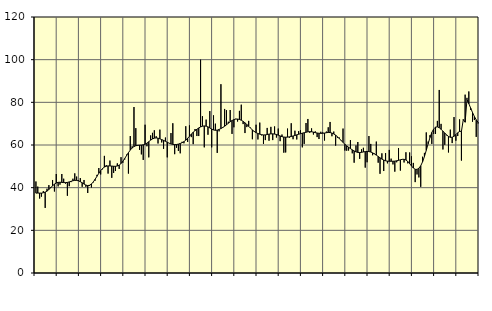
| Category | Piggar | Series 1 |
|---|---|---|
| nan | 42.9 | 37.44 |
| 1.0 | 40.5 | 37.48 |
| 1.0 | 34.9 | 37.45 |
| 1.0 | 35.8 | 37.44 |
| 1.0 | 38.4 | 37.61 |
| 1.0 | 30.5 | 37.92 |
| 1.0 | 39.5 | 38.38 |
| 1.0 | 41.2 | 39.11 |
| 1.0 | 40.3 | 39.99 |
| 1.0 | 43.6 | 40.89 |
| 1.0 | 38.2 | 41.66 |
| 1.0 | 46.4 | 42.21 |
| nan | 40.6 | 42.49 |
| 2.0 | 41.4 | 42.54 |
| 2.0 | 46.4 | 42.47 |
| 2.0 | 44.2 | 42.38 |
| 2.0 | 41.9 | 42.36 |
| 2.0 | 36.2 | 42.46 |
| 2.0 | 40.7 | 42.7 |
| 2.0 | 42.6 | 42.99 |
| 2.0 | 44.2 | 43.25 |
| 2.0 | 46.7 | 43.41 |
| 2.0 | 45.2 | 43.41 |
| 2.0 | 43.6 | 43.21 |
| nan | 44.5 | 42.8 |
| 3.0 | 40.4 | 42.28 |
| 3.0 | 43.6 | 41.7 |
| 3.0 | 40.4 | 41.21 |
| 3.0 | 37.5 | 40.98 |
| 3.0 | 40.8 | 41.14 |
| 3.0 | 40.1 | 41.72 |
| 3.0 | 42.5 | 42.68 |
| 3.0 | 43.3 | 43.94 |
| 3.0 | 46 | 45.34 |
| 3.0 | 49.2 | 46.74 |
| 3.0 | 46.2 | 47.98 |
| nan | 48.6 | 48.97 |
| 4.0 | 54.9 | 49.65 |
| 4.0 | 50.6 | 50.04 |
| 4.0 | 46.6 | 50.2 |
| 4.0 | 52.7 | 50.2 |
| 4.0 | 44.6 | 50.12 |
| 4.0 | 46.9 | 50.03 |
| 4.0 | 47.8 | 50.01 |
| 4.0 | 51.4 | 50.16 |
| 4.0 | 48.8 | 50.57 |
| 4.0 | 54.3 | 51.31 |
| 4.0 | 51.7 | 52.4 |
| nan | 53.2 | 53.69 |
| 5.0 | 55.5 | 55.06 |
| 5.0 | 46.6 | 56.4 |
| 5.0 | 64.2 | 57.62 |
| 5.0 | 59.4 | 58.6 |
| 5.0 | 77.8 | 59.27 |
| 5.0 | 67.9 | 59.65 |
| 5.0 | 59.6 | 59.84 |
| 5.0 | 57.7 | 59.91 |
| 5.0 | 55.6 | 59.95 |
| 5.0 | 53 | 60.09 |
| 5.0 | 69.5 | 60.37 |
| nan | 59.4 | 60.87 |
| 6.0 | 54.2 | 61.55 |
| 6.0 | 64.5 | 62.27 |
| 6.0 | 65.7 | 62.86 |
| 6.0 | 66.9 | 63.21 |
| 6.0 | 64.1 | 63.32 |
| 6.0 | 60.7 | 63.19 |
| 6.0 | 67.2 | 62.9 |
| 6.0 | 61.2 | 62.54 |
| 6.0 | 58.2 | 62.15 |
| 6.0 | 63.5 | 61.73 |
| 6.0 | 54.2 | 61.3 |
| nan | 60.8 | 60.85 |
| 7.0 | 65.6 | 60.5 |
| 7.0 | 70.2 | 60.29 |
| 7.0 | 55.7 | 60.19 |
| 7.0 | 58.7 | 60.23 |
| 7.0 | 57.2 | 60.42 |
| 7.0 | 56.1 | 60.71 |
| 7.0 | 61.5 | 61.07 |
| 7.0 | 60.8 | 61.57 |
| 7.0 | 68.8 | 62.26 |
| 7.0 | 61.4 | 63.13 |
| 7.0 | 69.2 | 64.08 |
| nan | 63.7 | 65.09 |
| 8.0 | 60.4 | 66 |
| 8.0 | 67.5 | 66.75 |
| 8.0 | 64.2 | 67.39 |
| 8.0 | 64.2 | 67.99 |
| 8.0 | 100 | 68.47 |
| 8.0 | 73.5 | 68.8 |
| 8.0 | 58.9 | 68.94 |
| 8.0 | 71.9 | 68.83 |
| 8.0 | 64.8 | 68.5 |
| 8.0 | 75.9 | 67.99 |
| 8.0 | 58.9 | 67.47 |
| nan | 73.9 | 67.06 |
| 9.0 | 70 | 66.89 |
| 9.0 | 56.3 | 66.98 |
| 9.0 | 66.4 | 67.29 |
| 9.0 | 88.5 | 67.72 |
| 9.0 | 68 | 68.22 |
| 9.0 | 76.9 | 68.79 |
| 9.0 | 76.3 | 69.46 |
| 9.0 | 70.9 | 70.19 |
| 9.0 | 76.4 | 70.87 |
| 9.0 | 65.2 | 71.46 |
| 9.0 | 68.3 | 71.89 |
| nan | 72.3 | 72.14 |
| 10.0 | 71 | 72.16 |
| 10.0 | 76 | 71.97 |
| 10.0 | 78.9 | 71.61 |
| 10.0 | 69.8 | 71.07 |
| 10.0 | 65.6 | 70.39 |
| 10.0 | 68.4 | 69.61 |
| 10.0 | 71.3 | 68.77 |
| 10.0 | 68.1 | 67.9 |
| 10.0 | 62.7 | 67.08 |
| 10.0 | 66.1 | 66.35 |
| 10.0 | 69.5 | 65.8 |
| nan | 62.6 | 65.39 |
| 11.0 | 70.5 | 65.08 |
| 11.0 | 64.5 | 64.84 |
| 11.0 | 60.5 | 64.71 |
| 11.0 | 62.3 | 64.74 |
| 11.0 | 68 | 64.89 |
| 11.0 | 62 | 65.1 |
| 11.0 | 68.5 | 65.22 |
| 11.0 | 62.3 | 65.24 |
| 11.0 | 68.7 | 65.13 |
| 11.0 | 63.5 | 64.92 |
| 11.0 | 67.7 | 64.61 |
| nan | 61.8 | 64.24 |
| 12.0 | 64.9 | 63.92 |
| 12.0 | 56.4 | 63.71 |
| 12.0 | 56.5 | 63.65 |
| 12.0 | 67.7 | 63.7 |
| 12.0 | 63.4 | 63.82 |
| 12.0 | 70.2 | 63.99 |
| 12.0 | 62.7 | 64.22 |
| 12.0 | 66.7 | 64.47 |
| 12.0 | 62.6 | 64.76 |
| 12.0 | 66.5 | 65.04 |
| 12.0 | 66.9 | 65.31 |
| nan | 58.9 | 65.54 |
| 13.0 | 60.5 | 65.75 |
| 13.0 | 70.3 | 65.98 |
| 13.0 | 72.2 | 66.18 |
| 13.0 | 65.7 | 66.27 |
| 13.0 | 67.8 | 66.21 |
| 13.0 | 64.9 | 66.03 |
| 13.0 | 66.4 | 65.8 |
| 13.0 | 63.7 | 65.62 |
| 13.0 | 62.8 | 65.49 |
| 13.0 | 66.2 | 65.46 |
| 13.0 | 65.9 | 65.49 |
| nan | 62.1 | 65.59 |
| 14.0 | 66.3 | 65.76 |
| 14.0 | 68.3 | 65.88 |
| 14.0 | 70.8 | 65.84 |
| 14.0 | 64.1 | 65.59 |
| 14.0 | 66.3 | 65.19 |
| 14.0 | 59.7 | 64.62 |
| 14.0 | 63.4 | 63.87 |
| 14.0 | 63.5 | 63.01 |
| 14.0 | 62.3 | 62.1 |
| 14.0 | 67.7 | 61.18 |
| 14.0 | 57.4 | 60.33 |
| nan | 57.3 | 59.61 |
| 15.0 | 57.4 | 58.96 |
| 15.0 | 62.3 | 58.33 |
| 15.0 | 56.1 | 57.73 |
| 15.0 | 51.7 | 57.2 |
| 15.0 | 59.8 | 56.78 |
| 15.0 | 61.4 | 56.52 |
| 15.0 | 53.5 | 56.47 |
| 15.0 | 58 | 56.56 |
| 15.0 | 58.7 | 56.74 |
| 15.0 | 49.4 | 56.9 |
| 15.0 | 51.9 | 56.98 |
| nan | 64.2 | 56.93 |
| 16.0 | 60.5 | 56.7 |
| 16.0 | 55.2 | 56.31 |
| 16.0 | 56 | 55.8 |
| 16.0 | 61.6 | 55.24 |
| 16.0 | 51.7 | 54.63 |
| 16.0 | 46.5 | 53.99 |
| 16.0 | 56.1 | 53.4 |
| 16.0 | 47.8 | 52.94 |
| 16.0 | 56.2 | 52.6 |
| 16.0 | 51.4 | 52.42 |
| 16.0 | 57.7 | 52.37 |
| nan | 53.6 | 52.38 |
| 17.0 | 50.9 | 52.38 |
| 17.0 | 47.5 | 52.44 |
| 17.0 | 51.9 | 52.6 |
| 17.0 | 58.6 | 52.81 |
| 17.0 | 48 | 53.06 |
| 17.0 | 53.2 | 53.28 |
| 17.0 | 51.8 | 53.3 |
| 17.0 | 56.6 | 52.98 |
| 17.0 | 51.4 | 52.29 |
| 17.0 | 56.5 | 51.29 |
| 17.0 | 54.7 | 50.18 |
| nan | 51.6 | 49.2 |
| 18.0 | 42.6 | 48.61 |
| 18.0 | 46.2 | 48.57 |
| 18.0 | 44.8 | 49.11 |
| 18.0 | 40.4 | 50.27 |
| 18.0 | 54.5 | 52.1 |
| 18.0 | 56.3 | 54.58 |
| 18.0 | 65.9 | 57.51 |
| 18.0 | 61.6 | 60.59 |
| 18.0 | 64.6 | 63.48 |
| 18.0 | 60.5 | 65.88 |
| 18.0 | 65.2 | 67.52 |
| nan | 65.2 | 68.36 |
| 19.0 | 71.3 | 68.51 |
| 19.0 | 85.8 | 68.1 |
| 19.0 | 69.9 | 67.36 |
| 19.0 | 57.9 | 66.51 |
| 19.0 | 60.1 | 65.6 |
| 19.0 | 64.5 | 64.73 |
| 19.0 | 56.5 | 64.02 |
| 19.0 | 67.2 | 63.6 |
| 19.0 | 60.9 | 63.63 |
| 19.0 | 73.1 | 64.09 |
| 19.0 | 62 | 64.88 |
| nan | 64.2 | 65.75 |
| 20.0 | 72 | 66.35 |
| 20.0 | 52.7 | 66.43 |
| 20.0 | 72.1 | 71.81 |
| 20.0 | 83.6 | 70.69 |
| 20.0 | 82.1 | 81.29 |
| 20.0 | 85.1 | 79.38 |
| 20.0 | 76.4 | 77.3 |
| 20.0 | 70.9 | 75.24 |
| 20.0 | 71.7 | 73.36 |
| 20.0 | 63.8 | 71.8 |
| 20.0 | 70.1 | 70.67 |